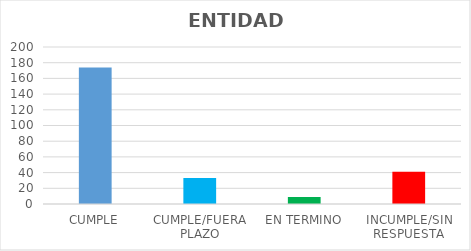
| Category | TOTAL |
|---|---|
| CUMPLE | 174 |
| CUMPLE/FUERA PLAZO | 33 |
| EN TERMINO | 9 |
| INCUMPLE/SIN RESPUESTA | 41 |